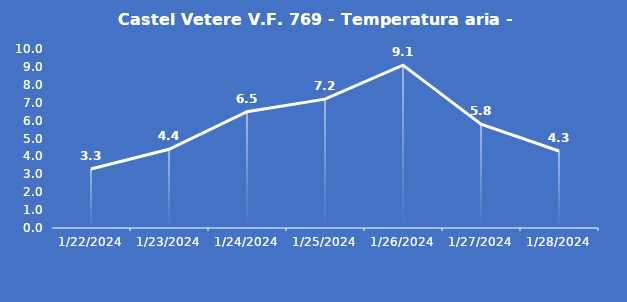
| Category | Castel Vetere V.F. 769 - Temperatura aria - Grezzo (°C) |
|---|---|
| 1/22/24 | 3.3 |
| 1/23/24 | 4.4 |
| 1/24/24 | 6.5 |
| 1/25/24 | 7.2 |
| 1/26/24 | 9.1 |
| 1/27/24 | 5.8 |
| 1/28/24 | 4.3 |